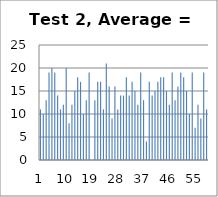
| Category | Series 0 |
|---|---|
| 0 | 11 |
| 1 | 10 |
| 2 | 13 |
| 3 | 19 |
| 4 | 20 |
| 5 | 19 |
| 6 | 14 |
| 7 | 11 |
| 8 | 12 |
| 9 | 20 |
| 10 | 8 |
| 11 | 12 |
| 12 | 15 |
| 13 | 18 |
| 14 | 17 |
| 15 | 10 |
| 16 | 13 |
| 17 | 19 |
| 18 | 0 |
| 19 | 13 |
| 20 | 17 |
| 21 | 17 |
| 22 | 11 |
| 23 | 21 |
| 24 | 16 |
| 25 | 9 |
| 26 | 16 |
| 27 | 11 |
| 28 | 14 |
| 29 | 14 |
| 30 | 18 |
| 31 | 14 |
| 32 | 17 |
| 33 | 15 |
| 34 | 12 |
| 35 | 19 |
| 36 | 13 |
| 37 | 4 |
| 38 | 17 |
| 39 | 14 |
| 40 | 15 |
| 41 | 17 |
| 42 | 18 |
| 43 | 18 |
| 44 | 15 |
| 45 | 12 |
| 46 | 19 |
| 47 | 13 |
| 48 | 16 |
| 49 | 19 |
| 50 | 18 |
| 51 | 15 |
| 52 | 10 |
| 53 | 19 |
| 54 | 7 |
| 55 | 12 |
| 56 | 9 |
| 57 | 19 |
| 58 | 11 |